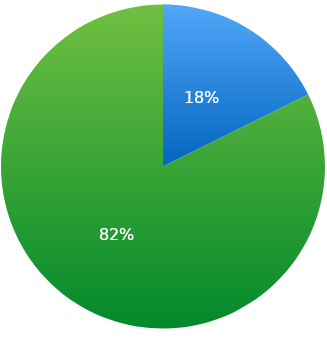
| Category | Senza titolo 1 |
|---|---|
| 0 | 65455 |
| 1 | 304758 |